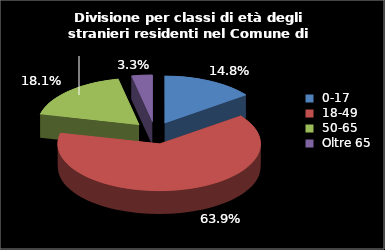
| Category | Series 0 |
|---|---|
| 0-17 | 76 |
| 18-49 | 329 |
| 50-65 | 93 |
| Oltre 65 | 17 |